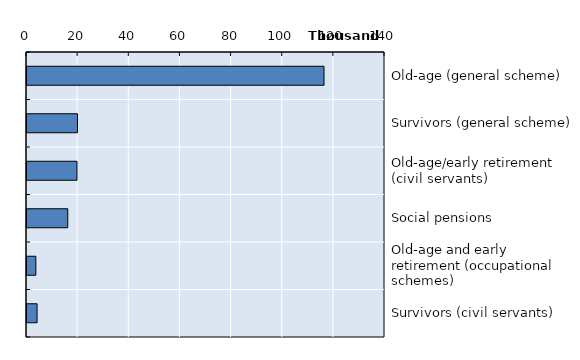
| Category | Series 0 |
|---|---|
| Old-age (general scheme) | 116154 |
| Survivors (general scheme) | 19739 |
| Old-age/early retirement (civil servants) | 19541 |
| Social pensions | 15940 |
| Old-age and early retirement (occupational schemes) | 3453 |
| Survivors (civil servants) | 3937 |